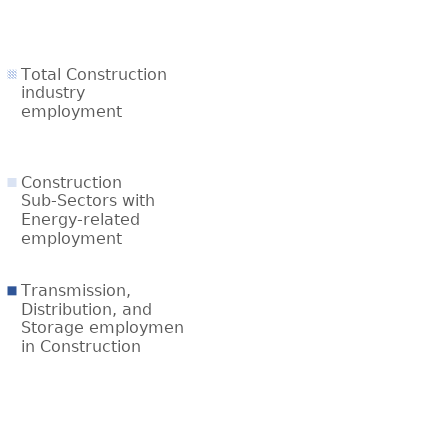
| Category | Total Construction industry employment | Construction Sub-Sectors with Energy-related employment | Transmission, Distribution, and Storage employment in Construction |
|---|---|---|---|
| Construction | 6548517 | 1241144 | 424592.931 |